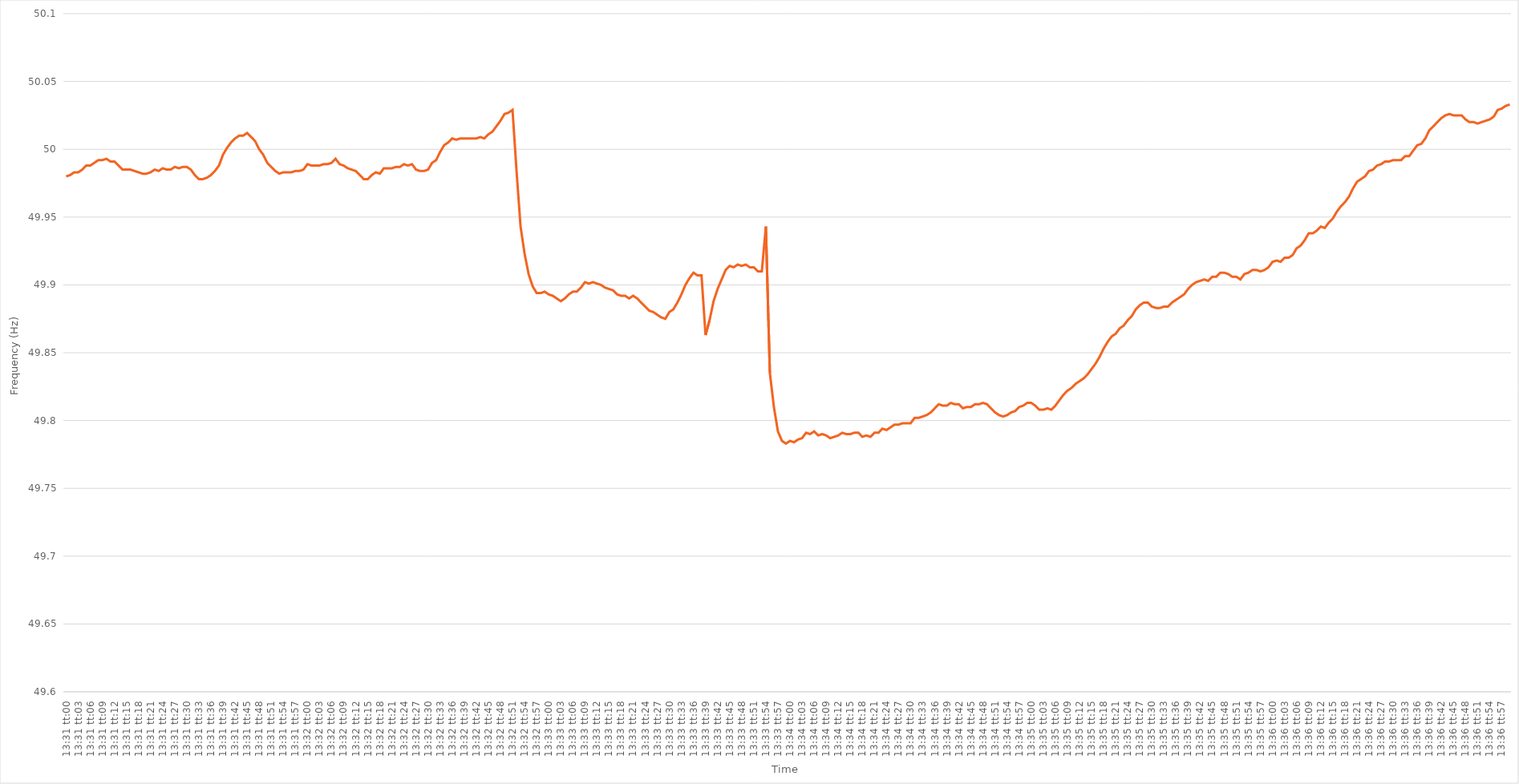
| Category | Series 0 |
|---|---|
| 0.5631944444444444 | 49.98 |
| 0.5632060185185185 | 49.981 |
| 0.5632175925925926 | 49.983 |
| 0.5632291666666667 | 49.983 |
| 0.5632407407407407 | 49.985 |
| 0.5632523148148149 | 49.988 |
| 0.5632638888888889 | 49.988 |
| 0.5632754629629629 | 49.99 |
| 0.563287037037037 | 49.992 |
| 0.5632986111111111 | 49.992 |
| 0.5633101851851852 | 49.993 |
| 0.5633217592592593 | 49.991 |
| 0.5633333333333334 | 49.991 |
| 0.5633449074074074 | 49.988 |
| 0.5633564814814814 | 49.985 |
| 0.5633680555555556 | 49.985 |
| 0.5633796296296296 | 49.985 |
| 0.5633912037037038 | 49.984 |
| 0.5634027777777778 | 49.983 |
| 0.5634143518518518 | 49.982 |
| 0.5634259259259259 | 49.982 |
| 0.5634375 | 49.983 |
| 0.5634490740740741 | 49.985 |
| 0.5634606481481481 | 49.984 |
| 0.5634722222222223 | 49.986 |
| 0.5634837962962963 | 49.985 |
| 0.5634953703703703 | 49.985 |
| 0.5635069444444444 | 49.987 |
| 0.5635185185185185 | 49.986 |
| 0.5635300925925926 | 49.987 |
| 0.5635416666666667 | 49.987 |
| 0.5635532407407408 | 49.985 |
| 0.5635648148148148 | 49.981 |
| 0.5635763888888888 | 49.978 |
| 0.563587962962963 | 49.978 |
| 0.563599537037037 | 49.979 |
| 0.5636111111111112 | 49.981 |
| 0.5636226851851852 | 49.984 |
| 0.5636342592592593 | 49.988 |
| 0.5636458333333333 | 49.996 |
| 0.5636574074074074 | 50.001 |
| 0.5636689814814815 | 50.005 |
| 0.5636805555555555 | 50.008 |
| 0.5636921296296297 | 50.01 |
| 0.5637037037037037 | 50.01 |
| 0.5637152777777777 | 50.012 |
| 0.5637268518518518 | 50.009 |
| 0.5637384259259259 | 50.006 |
| 0.56375 | 50 |
| 0.5637615740740741 | 49.996 |
| 0.5637731481481482 | 49.99 |
| 0.5637847222222222 | 49.987 |
| 0.5637962962962962 | 49.984 |
| 0.5638078703703704 | 49.982 |
| 0.5638194444444444 | 49.983 |
| 0.5638310185185186 | 49.983 |
| 0.5638425925925926 | 49.983 |
| 0.5638541666666667 | 49.984 |
| 0.5638657407407407 | 49.984 |
| 0.5638773148148148 | 49.985 |
| 0.5638888888888889 | 49.989 |
| 0.563900462962963 | 49.988 |
| 0.5639120370370371 | 49.988 |
| 0.5639236111111111 | 49.988 |
| 0.5639351851851852 | 49.989 |
| 0.5639467592592592 | 49.989 |
| 0.5639583333333333 | 49.99 |
| 0.5639699074074074 | 49.993 |
| 0.5639814814814815 | 49.989 |
| 0.5639930555555556 | 49.988 |
| 0.5640046296296296 | 49.986 |
| 0.5640162037037036 | 49.985 |
| 0.5640277777777778 | 49.984 |
| 0.5640393518518518 | 49.981 |
| 0.564050925925926 | 49.978 |
| 0.5640625 | 49.978 |
| 0.5640740740740741 | 49.981 |
| 0.5640856481481481 | 49.983 |
| 0.5640972222222222 | 49.982 |
| 0.5641087962962963 | 49.986 |
| 0.5641203703703704 | 49.986 |
| 0.5641319444444445 | 49.986 |
| 0.5641435185185185 | 49.987 |
| 0.5641550925925926 | 49.987 |
| 0.5641666666666666 | 49.989 |
| 0.5641782407407407 | 49.988 |
| 0.5641898148148148 | 49.989 |
| 0.5642013888888889 | 49.985 |
| 0.564212962962963 | 49.984 |
| 0.564224537037037 | 49.984 |
| 0.564236111111111 | 49.985 |
| 0.5642476851851852 | 49.99 |
| 0.5642592592592592 | 49.992 |
| 0.5642708333333334 | 49.998 |
| 0.5642824074074074 | 50.003 |
| 0.5642939814814815 | 50.005 |
| 0.5643055555555555 | 50.008 |
| 0.5643171296296297 | 50.007 |
| 0.5643287037037037 | 50.008 |
| 0.5643402777777778 | 50.008 |
| 0.5643518518518519 | 50.008 |
| 0.5643634259259259 | 50.008 |
| 0.564375 | 50.008 |
| 0.5643865740740741 | 50.009 |
| 0.5643981481481481 | 50.008 |
| 0.5644097222222222 | 50.011 |
| 0.5644212962962963 | 50.013 |
| 0.5644328703703704 | 50.017 |
| 0.5644444444444444 | 50.021 |
| 0.5644560185185185 | 50.026 |
| 0.5644675925925926 | 50.027 |
| 0.5644791666666666 | 50.029 |
| 0.5644907407407408 | 49.984 |
| 0.5645023148148148 | 49.943 |
| 0.5645138888888889 | 49.923 |
| 0.5645254629629629 | 49.908 |
| 0.5645370370370371 | 49.899 |
| 0.5645486111111111 | 49.894 |
| 0.5645601851851852 | 49.894 |
| 0.5645717592592593 | 49.895 |
| 0.5645833333333333 | 49.893 |
| 0.5645949074074074 | 49.892 |
| 0.5646064814814815 | 49.89 |
| 0.5646180555555556 | 49.888 |
| 0.5646296296296297 | 49.89 |
| 0.5646412037037037 | 49.893 |
| 0.5646527777777778 | 49.895 |
| 0.5646643518518518 | 49.895 |
| 0.5646759259259259 | 49.898 |
| 0.5646875 | 49.902 |
| 0.564699074074074 | 49.901 |
| 0.5647106481481482 | 49.902 |
| 0.5647222222222222 | 49.901 |
| 0.5647337962962963 | 49.9 |
| 0.5647453703703703 | 49.898 |
| 0.5647569444444445 | 49.897 |
| 0.5647685185185185 | 49.896 |
| 0.5647800925925927 | 49.893 |
| 0.5647916666666667 | 49.892 |
| 0.5648032407407407 | 49.892 |
| 0.5648148148148148 | 49.89 |
| 0.5648263888888889 | 49.892 |
| 0.564837962962963 | 49.89 |
| 0.5648495370370371 | 49.887 |
| 0.5648611111111111 | 49.884 |
| 0.5648726851851852 | 49.881 |
| 0.5648842592592592 | 49.88 |
| 0.5648958333333333 | 49.878 |
| 0.5649074074074074 | 49.876 |
| 0.5649189814814815 | 49.875 |
| 0.5649305555555556 | 49.88 |
| 0.5649421296296296 | 49.882 |
| 0.5649537037037037 | 49.887 |
| 0.5649652777777777 | 49.893 |
| 0.5649768518518519 | 49.9 |
| 0.5649884259259259 | 49.905 |
| 0.5650000000000001 | 49.909 |
| 0.5650115740740741 | 49.907 |
| 0.5650231481481481 | 49.907 |
| 0.5650347222222222 | 49.863 |
| 0.5650462962962963 | 49.874 |
| 0.5650578703703704 | 49.888 |
| 0.5650694444444445 | 49.897 |
| 0.5650810185185186 | 49.904 |
| 0.5650925925925926 | 49.911 |
| 0.5651041666666666 | 49.914 |
| 0.5651157407407407 | 49.913 |
| 0.5651273148148148 | 49.915 |
| 0.5651388888888889 | 49.914 |
| 0.565150462962963 | 49.915 |
| 0.565162037037037 | 49.913 |
| 0.5651736111111111 | 49.913 |
| 0.5651851851851851 | 49.91 |
| 0.5651967592592593 | 49.91 |
| 0.5652083333333333 | 49.943 |
| 0.5652199074074075 | 49.835 |
| 0.5652314814814815 | 49.81 |
| 0.5652430555555555 | 49.792 |
| 0.5652546296296296 | 49.785 |
| 0.5652662037037037 | 49.783 |
| 0.5652777777777778 | 49.785 |
| 0.5652893518518519 | 49.784 |
| 0.565300925925926 | 49.786 |
| 0.5653125 | 49.787 |
| 0.565324074074074 | 49.791 |
| 0.5653356481481482 | 49.79 |
| 0.5653472222222222 | 49.792 |
| 0.5653587962962963 | 49.789 |
| 0.5653703703703704 | 49.79 |
| 0.5653819444444445 | 49.789 |
| 0.5653935185185185 | 49.787 |
| 0.5654050925925925 | 49.788 |
| 0.5654166666666667 | 49.789 |
| 0.5654282407407407 | 49.791 |
| 0.5654398148148149 | 49.79 |
| 0.5654513888888889 | 49.79 |
| 0.565462962962963 | 49.791 |
| 0.565474537037037 | 49.791 |
| 0.5654861111111111 | 49.788 |
| 0.5654976851851852 | 49.789 |
| 0.5655092592592593 | 49.788 |
| 0.5655208333333334 | 49.791 |
| 0.5655324074074074 | 49.791 |
| 0.5655439814814814 | 49.794 |
| 0.5655555555555556 | 49.793 |
| 0.5655671296296296 | 49.795 |
| 0.5655787037037037 | 49.797 |
| 0.5655902777777778 | 49.797 |
| 0.5656018518518519 | 49.798 |
| 0.5656134259259259 | 49.798 |
| 0.5656249999999999 | 49.798 |
| 0.5656365740740741 | 49.802 |
| 0.5656481481481481 | 49.802 |
| 0.5656597222222223 | 49.803 |
| 0.5656712962962963 | 49.804 |
| 0.5656828703703703 | 49.806 |
| 0.5656944444444444 | 49.809 |
| 0.5657060185185185 | 49.812 |
| 0.5657175925925926 | 49.811 |
| 0.5657291666666667 | 49.811 |
| 0.5657407407407408 | 49.813 |
| 0.5657523148148148 | 49.812 |
| 0.5657638888888888 | 49.812 |
| 0.565775462962963 | 49.809 |
| 0.565787037037037 | 49.81 |
| 0.5657986111111112 | 49.81 |
| 0.5658101851851852 | 49.812 |
| 0.5658217592592593 | 49.812 |
| 0.5658333333333333 | 49.813 |
| 0.5658449074074073 | 49.812 |
| 0.5658564814814815 | 49.809 |
| 0.5658680555555555 | 49.806 |
| 0.5658796296296297 | 49.804 |
| 0.5658912037037037 | 49.803 |
| 0.5659027777777778 | 49.804 |
| 0.5659143518518518 | 49.806 |
| 0.5659259259259259 | 49.807 |
| 0.5659375 | 49.81 |
| 0.5659490740740741 | 49.811 |
| 0.5659606481481482 | 49.813 |
| 0.5659722222222222 | 49.813 |
| 0.5659837962962962 | 49.811 |
| 0.5659953703703704 | 49.808 |
| 0.5660069444444444 | 49.808 |
| 0.5660185185185186 | 49.809 |
| 0.5660300925925926 | 49.808 |
| 0.5660416666666667 | 49.811 |
| 0.5660532407407407 | 49.815 |
| 0.5660648148148147 | 49.819 |
| 0.5660763888888889 | 49.822 |
| 0.5660879629629629 | 49.824 |
| 0.5660995370370371 | 49.827 |
| 0.5661111111111111 | 49.829 |
| 0.5661226851851852 | 49.831 |
| 0.5661342592592592 | 49.834 |
| 0.5661458333333333 | 49.838 |
| 0.5661574074074074 | 49.842 |
| 0.5661689814814815 | 49.847 |
| 0.5661805555555556 | 49.853 |
| 0.5661921296296296 | 49.858 |
| 0.5662037037037037 | 49.862 |
| 0.5662152777777778 | 49.864 |
| 0.5662268518518518 | 49.868 |
| 0.566238425925926 | 49.87 |
| 0.56625 | 49.874 |
| 0.5662615740740741 | 49.877 |
| 0.5662731481481481 | 49.882 |
| 0.5662847222222223 | 49.885 |
| 0.5662962962962963 | 49.887 |
| 0.5663078703703703 | 49.887 |
| 0.5663194444444445 | 49.884 |
| 0.5663310185185185 | 49.883 |
| 0.5663425925925926 | 49.883 |
| 0.5663541666666666 | 49.884 |
| 0.5663657407407408 | 49.884 |
| 0.5663773148148148 | 49.887 |
| 0.5663888888888889 | 49.889 |
| 0.566400462962963 | 49.891 |
| 0.566412037037037 | 49.893 |
| 0.5664236111111111 | 49.897 |
| 0.5664351851851852 | 49.9 |
| 0.5664467592592592 | 49.902 |
| 0.5664583333333334 | 49.903 |
| 0.5664699074074074 | 49.904 |
| 0.5664814814814815 | 49.903 |
| 0.5664930555555555 | 49.906 |
| 0.5665046296296297 | 49.906 |
| 0.5665162037037037 | 49.909 |
| 0.5665277777777777 | 49.909 |
| 0.5665393518518519 | 49.908 |
| 0.5665509259259259 | 49.906 |
| 0.5665625 | 49.906 |
| 0.566574074074074 | 49.904 |
| 0.5665856481481482 | 49.908 |
| 0.5665972222222222 | 49.909 |
| 0.5666087962962963 | 49.911 |
| 0.5666203703703704 | 49.911 |
| 0.5666319444444444 | 49.91 |
| 0.5666435185185185 | 49.911 |
| 0.5666550925925926 | 49.913 |
| 0.5666666666666667 | 49.917 |
| 0.5666782407407408 | 49.918 |
| 0.5666898148148148 | 49.917 |
| 0.5667013888888889 | 49.92 |
| 0.5667129629629629 | 49.92 |
| 0.5667245370370371 | 49.922 |
| 0.5667361111111111 | 49.927 |
| 0.5667476851851853 | 49.929 |
| 0.5667592592592593 | 49.933 |
| 0.5667708333333333 | 49.938 |
| 0.5667824074074074 | 49.938 |
| 0.5667939814814814 | 49.94 |
| 0.5668055555555556 | 49.943 |
| 0.5668171296296296 | 49.942 |
| 0.5668287037037038 | 49.946 |
| 0.5668402777777778 | 49.949 |
| 0.5668518518518518 | 49.954 |
| 0.5668634259259259 | 49.958 |
| 0.566875 | 49.961 |
| 0.5668865740740741 | 49.965 |
| 0.5668981481481482 | 49.971 |
| 0.5669097222222222 | 49.976 |
| 0.5669212962962963 | 49.978 |
| 0.5669328703703703 | 49.98 |
| 0.5669444444444445 | 49.984 |
| 0.5669560185185185 | 49.985 |
| 0.5669675925925927 | 49.988 |
| 0.5669791666666667 | 49.989 |
| 0.5669907407407407 | 49.991 |
| 0.5670023148148148 | 49.991 |
| 0.5670138888888888 | 49.992 |
| 0.567025462962963 | 49.992 |
| 0.567037037037037 | 49.992 |
| 0.5670486111111112 | 49.995 |
| 0.5670601851851852 | 49.995 |
| 0.5670717592592592 | 49.999 |
| 0.5670833333333333 | 50.003 |
| 0.5670949074074074 | 50.004 |
| 0.5671064814814815 | 50.008 |
| 0.5671180555555556 | 50.014 |
| 0.5671296296296297 | 50.017 |
| 0.5671412037037037 | 50.02 |
| 0.5671527777777777 | 50.023 |
| 0.5671643518518519 | 50.025 |
| 0.5671759259259259 | 50.026 |
| 0.5671875000000001 | 50.025 |
| 0.5671990740740741 | 50.025 |
| 0.5672106481481481 | 50.025 |
| 0.5672222222222222 | 50.022 |
| 0.5672337962962963 | 50.02 |
| 0.5672453703703704 | 50.02 |
| 0.5672569444444444 | 50.019 |
| 0.5672685185185186 | 50.02 |
| 0.5672800925925926 | 50.021 |
| 0.5672916666666666 | 50.022 |
| 0.5673032407407407 | 50.024 |
| 0.5673148148148148 | 50.029 |
| 0.5673263888888889 | 50.03 |
| 0.567337962962963 | 50.032 |
| 0.567349537037037 | 50.033 |